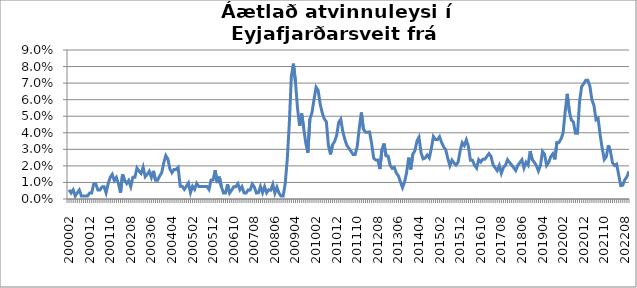
| Category | Series 0 |
|---|---|
| 200002 | 0.006 |
| 200003 | 0.004 |
| 200004 | 0.006 |
| 200005 | 0.002 |
| 200006 | 0.004 |
| 200007 | 0.005 |
| 200008 | 0.002 |
| 200009 | 0.002 |
| 200010 | 0.002 |
| 200011 | 0.002 |
| 200012 | 0.004 |
| 200101 | 0.004 |
| 200102 | 0.009 |
| 200103 | 0.009 |
| 200104 | 0.005 |
| 200105 | 0.005 |
| 200106 | 0.007 |
| 200107 | 0.007 |
| 200108 | 0.004 |
| 200109 | 0.009 |
| 200110 | 0.013 |
| 200111 | 0.015 |
| 200112 | 0.011 |
| 200201 | 0.013 |
| 200202 | 0.009 |
| 200203 | 0.004 |
| 200204 | 0.015 |
| 200205 | 0.011 |
| 200206 | 0.009 |
| 200207 | 0.011 |
| 200208 | 0.007 |
| 200209 | 0.013 |
| 200210 | 0.013 |
| 200211 | 0.019 |
| 200212 | 0.017 |
| 200301 | 0.015 |
| 200302 | 0.019 |
| 200303 | 0.013 |
| 200304 | 0.015 |
| 200305 | 0.017 |
| 200306 | 0.013 |
| 200307 | 0.017 |
| 200308 | 0.011 |
| 200309 | 0.011 |
| 200310 | 0.014 |
| 200311 | 0.016 |
| 200312 | 0.022 |
| 200401 | 0.026 |
| 200402 | 0.024 |
| 200403 | 0.018 |
| 200404 | 0.016 |
| 200405 | 0.018 |
| 200406 | 0.018 |
| 200407 | 0.019 |
| 200408 | 0.008 |
| 200409 | 0.008 |
| 200410 | 0.006 |
| 200411 | 0.008 |
| 200412 | 0.01 |
| 200501 | 0.004 |
| 200502 | 0.008 |
| 200503 | 0.006 |
| 200504 | 0.009 |
| 200505 | 0.008 |
| 200506 | 0.008 |
| 200507 | 0.007 |
| 200508 | 0.007 |
| 200509 | 0.007 |
| 200510 | 0.006 |
| 200511 | 0.012 |
| 200512 | 0.012 |
| 200601 | 0.017 |
| 200602 | 0.01 |
| 200603 | 0.013 |
| 200604 | 0.007 |
| 200605 | 0.004 |
| 200606 | 0.004 |
| 200607 | 0.009 |
| 200608 | 0.004 |
| 200609 | 0.005 |
| 200610 | 0.007 |
| 200611 | 0.007 |
| 200612 | 0.009 |
| 200701 | 0.006 |
| 200702 | 0.007 |
| 200703 | 0.004 |
| 200704 | 0.004 |
| 200705 | 0.005 |
| 200706 | 0.005 |
| 200707 | 0.009 |
| 200708 | 0.007 |
| 200709 | 0.004 |
| 200710 | 0.004 |
| 200711 | 0.008 |
| 200712 | 0.004 |
| 200801 | 0.007 |
| 200802 | 0.004 |
| 200803 | 0.006 |
| 200804 | 0.005 |
| 200805 | 0.009 |
| 200806 | 0.004 |
| 200807 | 0.007 |
| 200808 | 0.004 |
| 200809 | 0.002 |
| 200810 | 0.002 |
| 200811 | 0.009 |
| 200812 | 0.024 |
| 200901 | 0.046 |
| 200902 | 0.074 |
| 200903 | 0.082 |
| 200904 | 0.071 |
| 200905 | 0.055 |
| 200906 | 0.044 |
| 200907 | 0.052 |
| 200908 | 0.043 |
| 200909 | 0.034 |
| 200910 | 0.028 |
| 200911 | 0.048 |
| 200912 | 0.052 |
| 201001 | 0.06 |
| 201002 | 0.068 |
| 201003 | 0.066 |
| 201004 | 0.057 |
| 201005 | 0.052 |
| 201006 | 0.048 |
| 201007 | 0.047 |
| 201008 | 0.032 |
| 201009 | 0.027 |
| 201010 | 0.033 |
| 201011 | 0.035 |
| 201012 | 0.038 |
| 201101 | 0.046 |
| 201102 | 0.048 |
| 201103 | 0.041 |
| 201104 | 0.036 |
| 201105 | 0.032 |
| 201106 | 0.031 |
| 201107 | 0.029 |
| 201108 | 0.027 |
| 201109 | 0.027 |
| 201110 | 0.032 |
| 201111 | 0.043 |
| 201112 | 0.052 |
| 201201 | 0.042 |
| 201202 | 0.04 |
| 201203 | 0.04 |
| 201204 | 0.04 |
| 201205 | 0.033 |
| 201206 | 0.025 |
| 201207 | 0.024 |
| 201208 | 0.024 |
| 201209 | 0.018 |
| 201210 | 0.03 |
| 201211 | 0.034 |
| 201212 | 0.026 |
| 201301 | 0.026 |
| 201302 | 0.02 |
| 201303 | 0.019 |
| 201304 | 0.019 |
| 201305 | 0.016 |
| 201306 | 0.014 |
| 201307 | 0.01 |
| 201308 | 0.007 |
| 201309 | 0.01 |
| 201310 | 0.016 |
| 201311 | 0.025 |
| 201312 | 0.018 |
| 201401 | 0.027 |
| 201402 | 0.029 |
| 201403 | 0.035 |
| 201404 | 0.037 |
| 201405 | 0.028 |
| 201406 | 0.024 |
| 201407 | 0.025 |
| 201408 | 0.027 |
| 201409 | 0.025 |
| 201410 | 0.031 |
| 201411 | 0.038 |
| 201412 | 0.036 |
| 201501 | 0.036 |
| 201502 | 0.038 |
| 201503 | 0.034 |
| 201504 | 0.031 |
| 201505 | 0.03 |
| 201506 | 0.024 |
| 201507 | 0.02 |
| 201508 | 0.023 |
| 201509 | 0.022 |
| 201510 | 0.021 |
| 201511 | 0.022 |
| 201512 | 0.029 |
| 201601 | 0.034 |
| 201602 | 0.032 |
| 201603 | 0.036 |
| 201604 | 0.032 |
| 201605 | 0.023 |
| 201606 | 0.023 |
| 201607 | 0.02 |
| 201608 | 0.019 |
| 201609 | 0.024 |
| 201610 | 0.022 |
| 201611 | 0.024 |
| 201612 | 0.024 |
| 201701 | 0.026 |
| 201702 | 0.027 |
| 201703 | 0.026 |
| 201704 | 0.021 |
| 201705 | 0.019 |
| 201706 | 0.017 |
| 201707 | 0.02 |
| 201708 | 0.016 |
| 201709 | 0.019 |
| 201710 | 0.02 |
| 201711 | 0.024 |
| 201712 | 0.022 |
| 201801 | 0.021 |
| 201802 | 0.019 |
| 201803 | 0.017 |
| 201804 | 0.02 |
| 201805 | 0.022 |
| 201806 | 0.024 |
| 201807 | 0.019 |
| 201808 | 0.022 |
| 201809 | 0.02 |
| 201810 | 0.029 |
| 201811 | 0.024 |
| 201812 | 0.022 |
| 201901 | 0.02 |
| 201902 | 0.017 |
| 201903 | 0.02 |
| 201904 | 0.029 |
| 201905 | 0.027 |
| 201906 | 0.02 |
| 201907 | 0.022 |
| 201908 | 0.026 |
| 201909 | 0.027 |
| 201910 | 0.024 |
| 201911 | 0.034 |
| 201912 | 0.034 |
| 202001 | 0.036 |
| 202002 | 0.04 |
| 202003 | 0.053 |
| 202004 | 0.064 |
| 202005 | 0.053 |
| 202006 | 0.048 |
| 202007 | 0.047 |
| 202008 | 0.04 |
| 202009 | 0.04 |
| 202010 | 0.059 |
| 202011 | 0.068 |
| 202012 | 0.07 |
| 202101 | 0.072 |
| 202102 | 0.072 |
| 202103 | 0.068 |
| 202104 | 0.06 |
| 202105 | 0.056 |
| 202106 | 0.048 |
| 202107 | 0.049 |
| 202108 | 0.039 |
| 202109 | 0.031 |
| 202110 | 0.024 |
| 202111 | 0.026 |
| 202112 | 0.032 |
| 202201 | 0.029 |
| 202202 | 0.022 |
| 202203 | 0.02 |
| 202204 | 0.021 |
| 202205 | 0.015 |
| 202206 | 0.008 |
| 202207 | 0.008 |
| 202208 | 0.012 |
| 202209 | 0.013 |
| 202210 | 0.017 |